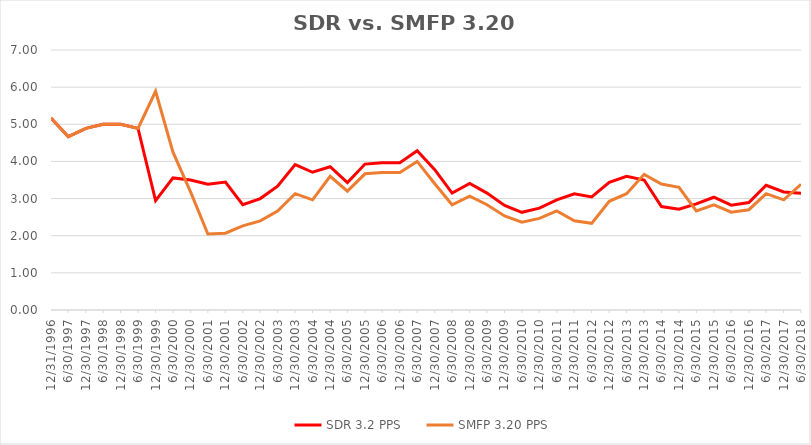
| Category | SDR 3.2 PPS | SMFP 3.20 PPS |
|---|---|---|
| 12/31/96 | 5.167 | 5.167 |
| 6/30/97 | 4.667 | 4.667 |
| 12/31/97 | 4.889 | 4.889 |
| 6/30/98 | 5 | 5 |
| 12/31/98 | 5 | 5 |
| 6/30/99 | 4.889 | 4.889 |
| 12/31/99 | 2.944 | 5.889 |
| 6/30/00 | 3.556 | 4.248 |
| 12/31/00 | 3.5 | 3.179 |
| 6/30/01 | 3.389 | 2.046 |
| 12/31/01 | 3.444 | 2.067 |
| 6/30/02 | 2.833 | 2.267 |
| 12/31/02 | 3 | 2.4 |
| 6/30/03 | 3.333 | 2.667 |
| 12/31/03 | 3.917 | 3.133 |
| 6/30/04 | 3.708 | 2.967 |
| 12/31/04 | 3.857 | 3.6 |
| 6/30/05 | 3.429 | 3.2 |
| 12/31/05 | 3.929 | 3.667 |
| 6/30/06 | 3.964 | 3.7 |
| 12/31/06 | 3.964 | 3.7 |
| 6/30/07 | 4.286 | 4 |
| 12/31/07 | 3.778 | 3.4 |
| 6/30/08 | 3.148 | 2.833 |
| 12/31/08 | 3.407 | 3.067 |
| 6/30/09 | 3.148 | 2.833 |
| 12/31/09 | 2.815 | 2.533 |
| 6/30/10 | 2.63 | 2.367 |
| 12/31/10 | 2.741 | 2.467 |
| 6/30/11 | 2.963 | 2.667 |
| 12/31/11 | 3.13 | 2.4 |
| 6/30/12 | 3.043 | 2.333 |
| 12/31/12 | 3.435 | 2.926 |
| 6/30/13 | 3.6 | 3.13 |
| 12/31/13 | 3.5 | 3.652 |
| 6/30/14 | 2.786 | 3.391 |
| 12/31/14 | 2.714 | 3.304 |
| 6/30/15 | 2.857 | 2.667 |
| 12/31/15 | 3.036 | 2.833 |
| 6/30/16 | 2.821 | 2.633 |
| 12/31/16 | 2.893 | 2.7 |
| 6/30/17 | 3.357 | 3.133 |
| 12/31/17 | 3.179 | 2.967 |
| 6/30/18 | 3.143 | 3.385 |